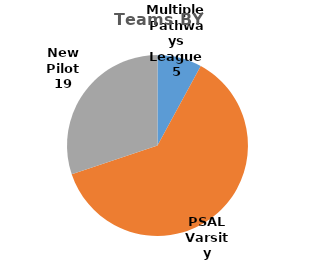
| Category | Teams |
|---|---|
| Multiple Pathways League | 5 |
| PSAL Varsity | 39 |
| New Pilot | 19 |